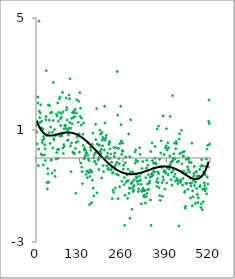
| Category | Series 0 |
|---|---|
| 2.0 | 1.182 |
| 3.0 | 0.928 |
| 4.0 | 0.504 |
| 5.0 | 2.174 |
| 6.0 | 1.967 |
| 7.0 | -0.267 |
| 8.0 | 0.315 |
| 9.0 | 4.887 |
| 10.0 | 1.67 |
| 11.0 | 1.442 |
| 12.0 | 1.269 |
| 13.0 | 1.607 |
| 14.0 | 1.9 |
| 15.0 | 0.144 |
| 16.0 | 1.077 |
| 17.0 | 1.314 |
| 18.0 | 0.104 |
| 19.0 | 0.548 |
| 20.0 | 0.632 |
| 21.0 | 1.034 |
| 22.0 | -0.249 |
| 23.0 | 0.765 |
| 24.0 | 0.685 |
| 25.0 | 0.108 |
| 26.0 | 0.469 |
| 27.0 | 0.325 |
| 28.0 | -0.09 |
| 29.0 | 1.364 |
| 30.0 | 1.484 |
| 31.0 | 3.118 |
| 32.0 | 0.803 |
| 33.0 | -0.874 |
| 34.0 | -1.104 |
| 35.0 | -0.378 |
| 36.0 | -0.566 |
| 37.0 | 1.89 |
| 38.0 | -0.866 |
| 39.0 | 0.908 |
| 40.0 | 1.35 |
| 41.0 | 1.872 |
| 42.0 | 0.52 |
| 43.0 | 1.611 |
| 44.0 | 1.109 |
| 45.0 | -0.082 |
| 46.0 | -0.064 |
| 47.0 | 1.637 |
| 48.0 | -0.541 |
| 49.0 | 0.918 |
| 50.0 | 0.355 |
| 51.0 | 1.34 |
| 52.0 | 2.701 |
| 53.0 | 0.69 |
| 54.0 | 0.646 |
| 55.0 | 1.016 |
| 56.0 | -0.448 |
| 57.0 | -0.657 |
| 58.0 | 0.797 |
| 59.0 | 0.825 |
| 60.0 | -0.041 |
| 61.0 | 1.569 |
| 62.0 | 0.192 |
| 63.0 | 1.501 |
| 64.0 | 0.306 |
| 65.0 | 1.965 |
| 66.0 | -0.014 |
| 67.0 | 1.313 |
| 68.0 | 0.305 |
| 69.0 | 1.628 |
| 70.0 | 2.113 |
| 71.0 | 0.784 |
| 72.0 | 2.177 |
| 73.0 | 1.405 |
| 74.0 | 1.16 |
| 75.0 | 1.591 |
| 76.0 | 1.46 |
| 77.0 | 0.781 |
| 78.0 | 0.835 |
| 79.0 | 2.342 |
| 80.0 | 0.356 |
| 81.0 | 1.65 |
| 82.0 | 0.158 |
| 83.0 | 0.48 |
| 84.0 | 1.041 |
| 85.0 | 0.414 |
| 86.0 | 1.165 |
| 87.0 | 1.134 |
| 88.0 | 1.162 |
| 89.0 | 1.052 |
| 90.0 | 2.146 |
| 91.0 | 1.716 |
| 92.0 | 1.802 |
| 93.0 | 1.354 |
| 94.0 | 0.627 |
| 95.0 | 0.987 |
| 96.0 | 0.647 |
| 97.0 | 0.832 |
| 98.0 | 1.062 |
| 99.0 | 2.249 |
| 100.0 | 2.112 |
| 101.0 | 1.267 |
| 102.0 | 2.828 |
| 103.0 | 0.427 |
| 104.0 | 1.061 |
| 105.0 | -0.49 |
| 106.0 | 0.54 |
| 107.0 | 1.415 |
| 108.0 | 1.226 |
| 109.0 | 1.626 |
| 110.0 | 0.214 |
| 111.0 | 1.441 |
| 112.0 | 0.181 |
| 113.0 | 1.6 |
| 114.0 | 1.676 |
| 115.0 | 0.158 |
| 116.0 | 1.477 |
| 117.0 | 1.741 |
| 118.0 | 0.344 |
| 119.0 | -1.26 |
| 120.0 | 0.555 |
| 121.0 | 1.604 |
| 122.0 | 2.082 |
| 123.0 | 0.742 |
| 124.0 | 0.835 |
| 125.0 | 0.591 |
| 126.0 | 1.276 |
| 127.0 | 0.842 |
| 128.0 | 2.021 |
| 129.0 | 0.862 |
| 130.0 | 0.209 |
| 131.0 | 2.336 |
| 132.0 | 1.48 |
| 133.0 | 1.776 |
| 134.0 | -0.179 |
| 135.0 | 1.172 |
| 136.0 | 1.421 |
| 137.0 | -0.327 |
| 138.0 | -0.488 |
| 139.0 | -0.917 |
| 140.0 | 0.849 |
| 141.0 | 0.455 |
| 142.0 | 1.248 |
| 143.0 | -0.017 |
| 144.0 | 0.285 |
| 145.0 | 0.359 |
| 146.0 | -0.01 |
| 147.0 | 0.075 |
| 148.0 | 0.282 |
| 149.0 | 0.158 |
| 150.0 | -0.581 |
| 151.0 | 0.194 |
| 152.0 | -0.472 |
| 153.0 | -0.706 |
| 154.0 | -0.471 |
| 155.0 | 0.099 |
| 156.0 | 0.534 |
| 157.0 | -0.037 |
| 158.0 | -0.092 |
| 159.0 | -0.527 |
| 160.0 | -1.664 |
| 161.0 | -0.662 |
| 162.0 | -0.428 |
| 163.0 | 0.378 |
| 164.0 | 0.273 |
| 165.0 | -0.503 |
| 166.0 | -1.6 |
| 167.0 | -0.482 |
| 168.0 | 0.491 |
| 169.0 | -0.793 |
| 170.0 | 0.889 |
| 171.0 | -1.081 |
| 172.0 | 0.004 |
| 173.0 | -1.353 |
| 174.0 | 0.106 |
| 175.0 | -0.126 |
| 176.0 | -0.127 |
| 177.0 | 0.189 |
| 178.0 | 1.204 |
| 179.0 | 0.658 |
| 180.0 | -0.218 |
| 181.0 | 1.765 |
| 182.0 | -1.245 |
| 183.0 | 0.499 |
| 184.0 | 0.218 |
| 185.0 | 0.183 |
| 186.0 | -0.068 |
| 187.0 | 0.465 |
| 188.0 | -0.411 |
| 189.0 | 0.014 |
| 190.0 | 0.465 |
| 191.0 | 0.997 |
| 192.0 | 0.24 |
| 193.0 | 0.851 |
| 194.0 | 0.163 |
| 195.0 | 0.311 |
| 196.0 | -0.713 |
| 197.0 | 0.916 |
| 198.0 | 0.637 |
| 199.0 | 0.433 |
| 200.0 | 0.735 |
| 201.0 | -0.272 |
| 202.0 | -0.485 |
| 203.0 | 0.674 |
| 204.0 | 0.282 |
| 205.0 | 1.846 |
| 206.0 | 1.252 |
| 207.0 | 0.632 |
| 208.0 | 0.02 |
| 209.0 | 0.72 |
| 210.0 | 0.809 |
| 211.0 | 0.011 |
| 212.0 | -0.273 |
| 213.0 | 0.068 |
| 214.0 | 0.174 |
| 215.0 | -0.405 |
| 216.0 | -0.367 |
| 217.0 | -0.023 |
| 218.0 | 0.479 |
| 219.0 | 0.526 |
| 220.0 | 0.591 |
| 221.0 | 0.328 |
| 222.0 | -0.007 |
| 223.0 | -0.427 |
| 224.0 | 0.142 |
| 225.0 | -0.419 |
| 226.0 | -0.149 |
| 227.0 | -0.329 |
| 228.0 | -1.457 |
| 229.0 | -0.536 |
| 230.0 | -1.149 |
| 231.0 | -0.525 |
| 232.0 | -1.229 |
| 233.0 | 0.377 |
| 234.0 | 0.058 |
| 235.0 | 0.177 |
| 236.0 | -0.298 |
| 237.0 | -1.075 |
| 238.0 | -0.398 |
| 239.0 | -0.223 |
| 240.0 | 0.356 |
| 241.0 | -0.575 |
| 242.0 | -0.148 |
| 243.0 | 3.088 |
| 244.0 | 1.528 |
| 245.0 | -1.452 |
| 246.0 | -0.613 |
| 247.0 | 0.346 |
| 248.0 | -0.015 |
| 249.0 | -0.207 |
| 250.0 | -1.024 |
| 251.0 | 0.512 |
| 252.0 | 0.516 |
| 253.0 | 1.849 |
| 254.0 | 1.188 |
| 255.0 | 0.611 |
| 256.0 | 0.128 |
| 257.0 | -0.827 |
| 258.0 | 0.266 |
| 259.0 | 0.532 |
| 260.0 | 0.24 |
| 261.0 | -0.4 |
| 262.0 | -0.257 |
| 263.0 | -0.951 |
| 264.0 | -0.697 |
| 265.0 | -2.407 |
| 266.0 | -1.33 |
| 267.0 | -0.169 |
| 268.0 | 0.034 |
| 269.0 | -0.866 |
| 270.0 | -0.562 |
| 271.0 | -0.59 |
| 272.0 | -0.816 |
| 273.0 | -0.606 |
| 274.0 | -1.441 |
| 275.0 | -0.397 |
| 276.0 | -0.815 |
| 277.0 | 0.855 |
| 278.0 | -1.26 |
| 279.0 | -1.075 |
| 280.0 | 0.045 |
| 281.0 | -2.155 |
| 282.0 | -0.504 |
| 283.0 | 1.362 |
| 284.0 | -1.089 |
| 285.0 | -0.913 |
| 286.0 | -0.88 |
| 287.0 | -1.831 |
| 288.0 | -0.853 |
| 289.0 | -0.5 |
| 290.0 | -1.195 |
| 291.0 | -1.041 |
| 292.0 | -1.144 |
| 293.0 | -0.985 |
| 294.0 | -0.778 |
| 295.0 | -0.573 |
| 296.0 | 0.214 |
| 297.0 | -0.181 |
| 298.0 | 0.293 |
| 299.0 | -0.08 |
| 300.0 | -0.668 |
| 301.0 | -0.717 |
| 302.0 | -0.833 |
| 303.0 | -0.558 |
| 304.0 | -0.119 |
| 305.0 | -0.931 |
| 306.0 | -1.203 |
| 307.0 | -1.104 |
| 308.0 | -0.818 |
| 309.0 | -0.654 |
| 310.0 | 0.362 |
| 311.0 | 0.129 |
| 312.0 | -0.792 |
| 313.0 | -0.555 |
| 314.0 | -0.936 |
| 315.0 | -1.634 |
| 316.0 | -1.166 |
| 317.0 | -0.378 |
| 318.0 | -1.197 |
| 319.0 | -0.124 |
| 320.0 | -1.072 |
| 321.0 | -1.125 |
| 322.0 | -1.374 |
| 323.0 | -1.316 |
| 324.0 | -1.385 |
| 325.0 | -1.177 |
| 326.0 | -1.15 |
| 327.0 | -1.61 |
| 328.0 | -0.705 |
| 329.0 | -1.378 |
| 330.0 | -0.358 |
| 331.0 | -0.078 |
| 332.0 | -1.269 |
| 333.0 | -0.93 |
| 334.0 | -0.257 |
| 335.0 | -1.123 |
| 336.0 | -0.597 |
| 337.0 | -1.124 |
| 338.0 | -0.886 |
| 339.0 | -0.892 |
| 340.0 | -0.827 |
| 341.0 | -0.688 |
| 342.0 | -1.498 |
| 343.0 | 0.234 |
| 344.0 | -2.401 |
| 345.0 | -0.582 |
| 346.0 | -0.657 |
| 347.0 | 0.536 |
| 348.0 | -0.096 |
| 349.0 | -0.512 |
| 350.0 | -0.611 |
| 351.0 | -0.186 |
| 352.0 | -0.347 |
| 353.0 | -0.482 |
| 354.0 | -0.489 |
| 355.0 | -0.011 |
| 356.0 | 0.411 |
| 357.0 | -0.17 |
| 358.0 | -0.21 |
| 359.0 | -0.209 |
| 360.0 | -0.843 |
| 361.0 | -1.011 |
| 362.0 | 1.031 |
| 363.0 | -0.739 |
| 364.0 | -0.493 |
| 365.0 | -0.873 |
| 366.0 | 1.138 |
| 367.0 | -0.555 |
| 368.0 | -1.059 |
| 369.0 | -0.047 |
| 370.0 | -1.342 |
| 371.0 | -1.512 |
| 372.0 | -0.301 |
| 373.0 | 0.181 |
| 374.0 | 0.613 |
| 375.0 | -0.321 |
| 376.0 | -0.333 |
| 377.0 | -0.88 |
| 378.0 | -1.372 |
| 379.0 | -0.674 |
| 380.0 | 1.505 |
| 381.0 | -0.782 |
| 382.0 | -0.497 |
| 383.0 | 0.122 |
| 384.0 | -0.446 |
| 385.0 | -1.111 |
| 386.0 | -0.504 |
| 387.0 | 0.359 |
| 388.0 | -0.539 |
| 389.0 | 0.436 |
| 390.0 | 1.049 |
| 391.0 | -0.895 |
| 392.0 | 0.286 |
| 393.0 | -0.35 |
| 394.0 | 0.543 |
| 395.0 | -0.594 |
| 396.0 | 0.366 |
| 397.0 | -0.386 |
| 398.0 | -0.398 |
| 399.0 | -0.27 |
| 400.0 | 0.07 |
| 401.0 | 1.486 |
| 402.0 | -0.232 |
| 403.0 | -0.151 |
| 404.0 | -0.775 |
| 405.0 | -0.519 |
| 406.0 | -0.967 |
| 407.0 | -0.117 |
| 408.0 | 2.225 |
| 409.0 | 0.001 |
| 410.0 | -0.443 |
| 411.0 | -0.067 |
| 412.0 | 0.149 |
| 413.0 | -0.667 |
| 414.0 | 0.525 |
| 415.0 | -0.578 |
| 416.0 | -0.023 |
| 417.0 | -0.824 |
| 418.0 | 0.331 |
| 419.0 | 0.587 |
| 420.0 | 0.513 |
| 421.0 | -0.732 |
| 422.0 | -0.141 |
| 423.0 | -0.789 |
| 424.0 | -0.921 |
| 425.0 | -0.813 |
| 426.0 | -0.112 |
| 427.0 | -2.431 |
| 428.0 | 0.675 |
| 429.0 | 0.866 |
| 430.0 | 0.159 |
| 431.0 | -0.863 |
| 432.0 | -0.865 |
| 433.0 | -0.785 |
| 434.0 | -0.464 |
| 435.0 | 0.989 |
| 436.0 | -0.21 |
| 437.0 | 0.196 |
| 438.0 | -0.969 |
| 439.0 | 0.068 |
| 440.0 | -0.729 |
| 441.0 | 0.069 |
| 442.0 | -0.469 |
| 443.0 | 0.235 |
| 444.0 | -1.233 |
| 445.0 | -1.181 |
| 446.0 | -1.79 |
| 447.0 | -1.725 |
| 448.0 | -0.907 |
| 449.0 | -0.049 |
| 450.0 | -0.537 |
| 451.0 | -0.906 |
| 452.0 | 0.001 |
| 453.0 | -0.315 |
| 454.0 | -1.12 |
| 455.0 | -0.412 |
| 456.0 | -0.001 |
| 457.0 | -0.056 |
| 458.0 | -0.151 |
| 459.0 | -0.494 |
| 460.0 | -0.897 |
| 461.0 | -0.726 |
| 462.0 | -1.427 |
| 463.0 | -0.998 |
| 464.0 | -0.164 |
| 465.0 | -0.897 |
| 466.0 | 0.529 |
| 467.0 | -1.707 |
| 468.0 | -1.174 |
| 469.0 | -1.386 |
| 470.0 | -0.8 |
| 471.0 | -0.645 |
| 472.0 | -0.559 |
| 473.0 | -0.301 |
| 474.0 | -0.98 |
| 475.0 | -0.855 |
| 476.0 | -1.621 |
| 477.0 | -0.858 |
| 478.0 | -0.499 |
| 479.0 | -0.485 |
| 480.0 | -1.084 |
| 481.0 | -0.639 |
| 482.0 | -1.301 |
| 483.0 | -0.683 |
| 484.0 | -1.592 |
| 485.0 | -1.417 |
| 486.0 | -0.657 |
| 487.0 | -0.721 |
| 488.0 | -0.64 |
| 489.0 | -0.406 |
| 490.0 | -1.023 |
| 491.0 | -0.983 |
| 492.0 | -0.293 |
| 493.0 | -1.765 |
| 494.0 | -1.64 |
| 495.0 | -0.061 |
| 496.0 | -0.27 |
| 497.0 | -1.849 |
| 498.0 | -1.116 |
| 499.0 | -0.286 |
| 500.0 | -1.56 |
| 501.0 | -0.495 |
| 502.0 | -1.095 |
| 503.0 | -0.889 |
| 504.0 | -0.984 |
| 505.0 | -1.171 |
| 506.0 | -0.596 |
| 507.0 | -0.296 |
| 508.0 | -1.093 |
| 509.0 | -0.04 |
| 510.0 | -1.278 |
| 511.0 | 0.316 |
| 512.0 | -0.685 |
| 513.0 | 0.453 |
| 514.0 | -0.932 |
| 515.0 | -0.32 |
| 516.0 | 1.31 |
| 517.0 | 2.069 |
| 518.0 | 1.228 |
| 519.0 | 0.498 |